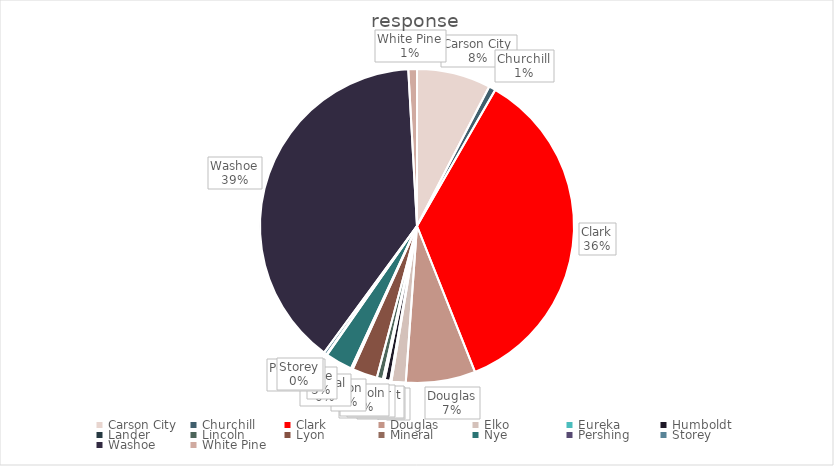
| Category | response |
|---|---|
| Carson City | 120 |
| Churchill | 11 |
| Clark | 563 |
| Douglas | 113 |
| Elko | 23 |
| Eureka | 2 |
| Humboldt | 9 |
| Lander | 3 |
| Lincoln | 10 |
| Lyon | 41 |
| Mineral | 3 |
| Nye | 44 |
| Pershing | 1 |
| Storey | 5 |
| Washoe | 616 |
| White Pine | 14 |